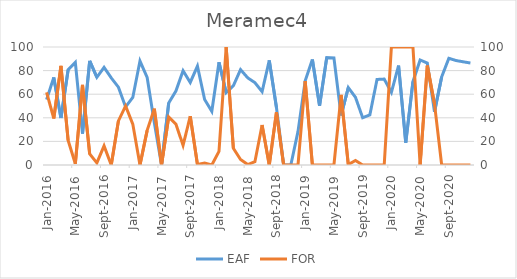
| Category | EAF |
|---|---|
| 2016-01-01 | 55.43 |
| 2016-02-01 | 74.24 |
| 2016-03-01 | 39.86 |
| 2016-04-01 | 80.72 |
| 2016-05-01 | 86.98 |
| 2016-06-01 | 26.51 |
| 2016-07-01 | 88.24 |
| 2016-08-01 | 74.31 |
| 2016-09-01 | 82.69 |
| 2016-10-01 | 73.79 |
| 2016-11-01 | 65.98 |
| 2016-12-01 | 49.2 |
| 2017-01-01 | 57.24 |
| 2017-02-01 | 88.1 |
| 2017-03-01 | 74.21 |
| 2017-04-01 | 35.69 |
| 2017-05-01 | 0 |
| 2017-06-01 | 52.56 |
| 2017-07-01 | 62.63 |
| 2017-08-01 | 79.84 |
| 2017-09-01 | 69.97 |
| 2017-10-01 | 83.75 |
| 2017-11-01 | 55.55 |
| 2017-12-01 | 45.51 |
| 2018-01-01 | 87.08 |
| 2018-02-01 | 61.32 |
| 2018-03-01 | 67.15 |
| 2018-04-01 | 80.83 |
| 2018-05-01 | 73.88 |
| 2018-06-01 | 69.77 |
| 2018-07-01 | 62.17 |
| 2018-08-01 | 88.66 |
| 2018-09-01 | 48.7 |
| 2018-10-01 | 0 |
| 2018-11-01 | 0 |
| 2018-12-01 | 28.47 |
| 2019-01-01 | 71.36 |
| 2019-02-01 | 89.49 |
| 2019-03-01 | 50.17 |
| 2019-04-01 | 91.04 |
| 2019-05-01 | 90.78 |
| 2019-06-01 | 42 |
| 2019-07-01 | 65.59 |
| 2019-08-01 | 57.37 |
| 2019-09-01 | 40.07 |
| 2019-10-01 | 42.46 |
| 2019-11-01 | 72.49 |
| 2019-12-01 | 72.81 |
| 2020-01-01 | 61.55 |
| 2020-02-01 | 84.28 |
| 2020-03-01 | 18.95 |
| 2020-04-01 | 70.6 |
| 2020-05-01 | 89.06 |
| 2020-06-01 | 86.41 |
| 2020-07-01 | 45.05 |
| 2020-08-01 | 74.71 |
| 2020-09-01 | 90.43 |
| 2020-10-01 | 88.52 |
| 2020-11-01 | 87.46 |
| 2020-12-01 | 86.43 |